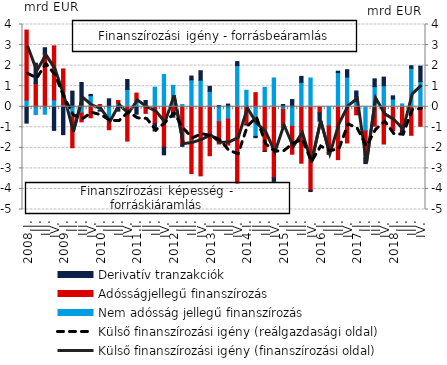
| Category | Nem adósság jellegű finanszírozás | Adósságjellegű finanszírozás | Derivatív tranzakciók |
|---|---|---|---|
| 2008.I. | 0.322 | 3.407 | -0.797 |
| II. | -0.385 | 1.131 | 0.986 |
| III. | -0.364 | 2.578 | 0.292 |
| IV. | 0.334 | 2.628 | -1.152 |
| 2009.I. | 0.096 | 1.742 | -1.358 |
| II. | -0.495 | -1.502 | 0.758 |
| III. | -0.31 | -0.426 | 1.181 |
| IV. | 0.54 | -0.537 | 0.06 |
| 2010.I. | -0.188 | 0.108 | -0.028 |
| II. | -0.709 | -0.411 | 0.384 |
| III. | 0.167 | 0.134 | -0.216 |
| IV. | 0.841 | -1.672 | 0.485 |
| 2011.I. | 0.279 | 0.384 | -0.362 |
| II. | -0.045 | -0.279 | 0.301 |
| III. | 0.951 | -0.827 | -0.355 |
| IV. | 1.566 | -1.967 | -0.372 |
| 2012.I. | 1.038 | -0.282 | -0.228 |
| II. | 0.107 | -1.816 | -0.112 |
| III. | 1.307 | -3.251 | 0.185 |
| IV. | 1.29 | -3.363 | 0.461 |
| 2013.I. | 0.752 | -2.385 | 0.238 |
| II. | -0.734 | -1.079 | 0.057 |
| III. | -0.601 | -1.268 | 0.129 |
| IV. | 2.002 | -3.715 | 0.193 |
| 2014.I. | 0.8 | -0.873 | -0.015 |
| II. | -1.445 | 0.687 | -0.062 |
| III. | 0.944 | -2.164 | -0.012 |
| IV. | 1.399 | -3.458 | -0.175 |
| 2015.I. | -0.131 | -0.886 | 0.108 |
| II. | -0.948 | -1.363 | 0.349 |
| III. | 1.187 | -2.748 | 0.289 |
| IV. | 1.397 | -4.068 | -0.059 |
| 2016.I. | -0.017 | -0.282 | -0.406 |
| II. | -0.933 | -1.305 | -0.078 |
| III. | 1.66 | -2.574 | 0.07 |
| IV. | 1.44 | -1.763 | 0.361 |
| 2017.I. | 0.285 | -0.396 | 0.483 |
| II. | -1.179 | -1.332 | -0.257 |
| III. | 0.978 | -0.946 | 0.378 |
| IV. | 1.022 | -1.815 | 0.419 |
| 2018.I. | 0.371 | -1.175 | 0.159 |
| II. | 0.137 | -1.136 | -0.11 |
| III. | 1.869 | -1.392 | 0.124 |
| IV. | 1.218 | -0.953 | 0.759 |